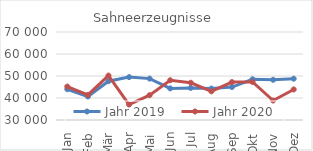
| Category | Jahr 2019 | Jahr 2020 |
|---|---|---|
| Jan | 43982.524 | 45201.36 |
| Feb | 40677.941 | 41400.761 |
| Mär | 47640.18 | 50204.262 |
| Apr | 49499.734 | 37036.307 |
| Mai | 48815.684 | 41295.583 |
| Jun | 44357.051 | 48069.618 |
| Jul | 44583.068 | 46931.322 |
| Aug | 44292.561 | 43021.606 |
| Sep | 44986.225 | 47229.405 |
| Okt | 48518.063 | 47288.004 |
| Nov | 48267.565 | 38844.975 |
| Dez | 48781.008 | 43884.052 |